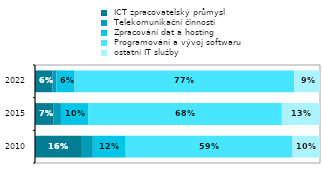
| Category |  ICT zpracovatelský průmysl |  Telekomunikační činnosti  |  Zpracování dat a hosting |  Programování a vývoj softwaru |  ostatní IT služby  |
|---|---|---|---|---|---|
| 2010.0 | 0.164 | 0.038 | 0.115 | 0.585 | 0.096 |
| 2015.0 | 0.065 | 0.026 | 0.095 | 0.68 | 0.134 |
| 2022.0 | 0.061 | 0.014 | 0.064 | 0.77 | 0.091 |